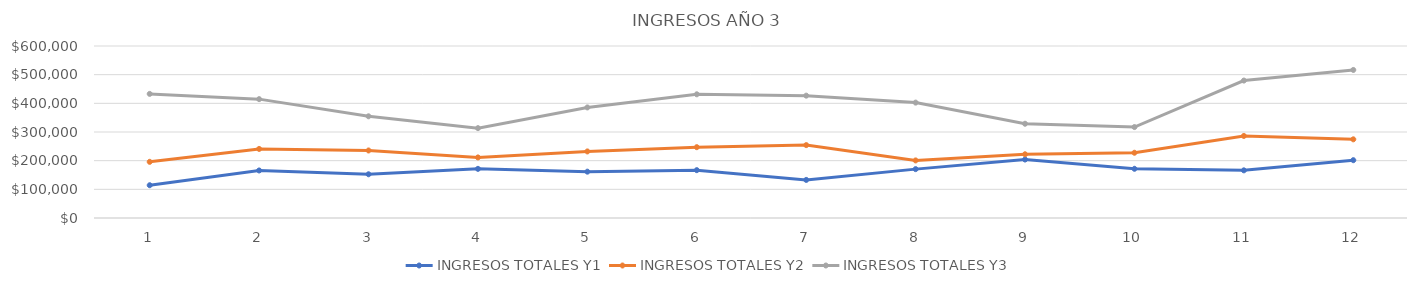
| Category | INGRESOS TOTALES Y1 | INGRESOS TOTALES Y2 | INGRESOS TOTALES Y3 |
|---|---|---|---|
| 0 | 114350 | 195956 | 432976 |
| 1 | 165800 | 240945 | 414652 |
| 2 | 152557 | 235555 | 354787 |
| 3 | 171421 | 211305 | 313504 |
| 4 | 161618 | 232213 | 385676 |
| 5 | 166870 | 247021 | 431520 |
| 6 | 132884 | 254266 | 426803 |
| 7 | 170481 | 200836 | 402533 |
| 8 | 203968 | 222280 | 328813 |
| 9 | 171681 | 227616 | 317269 |
| 10 | 166247 | 286221 | 479413 |
| 11 | 201651 | 274416 | 516463 |